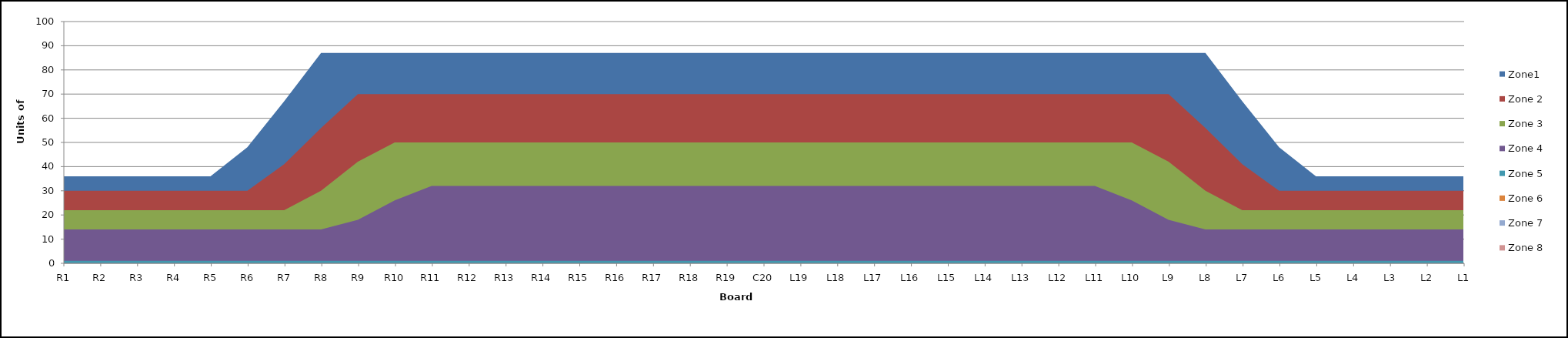
| Category | Zone1 | Zone 2 | Zone 3 | Zone 4 | Zone 5 | Zone 6 | Zone 7 | Zone 8 |
|---|---|---|---|---|---|---|---|---|
| L1 | 36 | 30 | 22 | 14 | 1 |  |  |  |
| L2 | 36 | 30 | 22 | 14 | 1 |  |  |  |
| L3 | 36 | 30 | 22 | 14 | 1 |  |  |  |
| L4 | 36 | 30 | 22 | 14 | 1 |  |  |  |
| L5 | 36 | 30 | 22 | 14 | 1 |  |  |  |
| L6 | 48 | 30 | 22 | 14 | 1 |  |  |  |
| L7 | 67 | 41 | 22 | 14 | 1 |  |  |  |
| L8 | 87 | 56 | 30 | 14 | 1 |  |  |  |
| L9 | 87 | 70 | 42 | 18 | 1 |  |  |  |
| L10 | 87 | 70 | 50 | 26 | 1 |  |  |  |
| L11 | 87 | 70 | 50 | 32 | 1 |  |  |  |
| L12 | 87 | 70 | 50 | 32 | 1 |  |  |  |
| L13 | 87 | 70 | 50 | 32 | 1 |  |  |  |
| L14 | 87 | 70 | 50 | 32 | 1 |  |  |  |
| L15 | 87 | 70 | 50 | 32 | 1 |  |  |  |
| L16 | 87 | 70 | 50 | 32 | 1 |  |  |  |
| L17 | 87 | 70 | 50 | 32 | 1 |  |  |  |
| L18 | 87 | 70 | 50 | 32 | 1 |  |  |  |
| L19 | 87 | 70 | 50 | 32 | 1 |  |  |  |
| C20 | 87 | 70 | 50 | 32 | 1 |  |  |  |
| R19 | 87 | 70 | 50 | 32 | 1 |  |  |  |
| R18 | 87 | 70 | 50 | 32 | 1 |  |  |  |
| R17 | 87 | 70 | 50 | 32 | 1 |  |  |  |
| R16 | 87 | 70 | 50 | 32 | 1 |  |  |  |
| R15 | 87 | 70 | 50 | 32 | 1 |  |  |  |
| R14 | 87 | 70 | 50 | 32 | 1 |  |  |  |
| R13 | 87 | 70 | 50 | 32 | 1 |  |  |  |
| R12 | 87 | 70 | 50 | 32 | 1 |  |  |  |
| R11 | 87 | 70 | 50 | 32 | 1 |  |  |  |
| R10 | 87 | 70 | 50 | 26 | 1 |  |  |  |
| R9 | 87 | 70 | 42 | 18 | 1 |  |  |  |
| R8 | 87 | 56 | 30 | 14 | 1 |  |  |  |
| R7 | 67 | 41 | 22 | 14 | 1 |  |  |  |
| R6 | 48 | 30 | 22 | 14 | 1 |  |  |  |
| R5 | 36 | 30 | 22 | 14 | 1 |  |  |  |
| R4 | 36 | 30 | 22 | 14 | 1 |  |  |  |
| R3 | 36 | 30 | 22 | 14 | 1 |  |  |  |
| R2 | 36 | 30 | 22 | 14 | 1 |  |  |  |
| R1 | 36 | 30 | 22 | 14 | 1 |  |  |  |